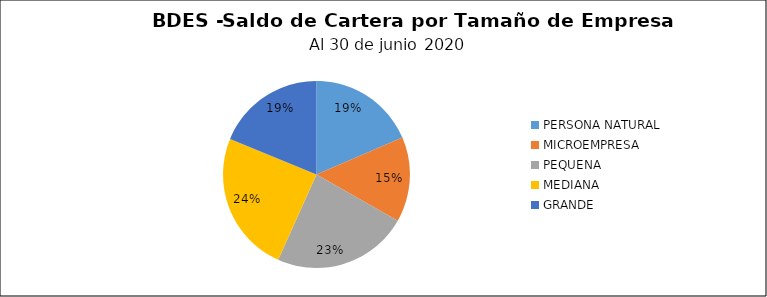
| Category | Saldo | Créditos |
|---|---|---|
| PERSONA NATURAL | 73.655 | 5757 |
| MICROEMPRESA | 58.445 | 8640 |
| PEQUENA | 93.276 | 2564 |
| MEDIANA | 97.351 | 1516 |
| GRANDE | 74.649 | 257 |